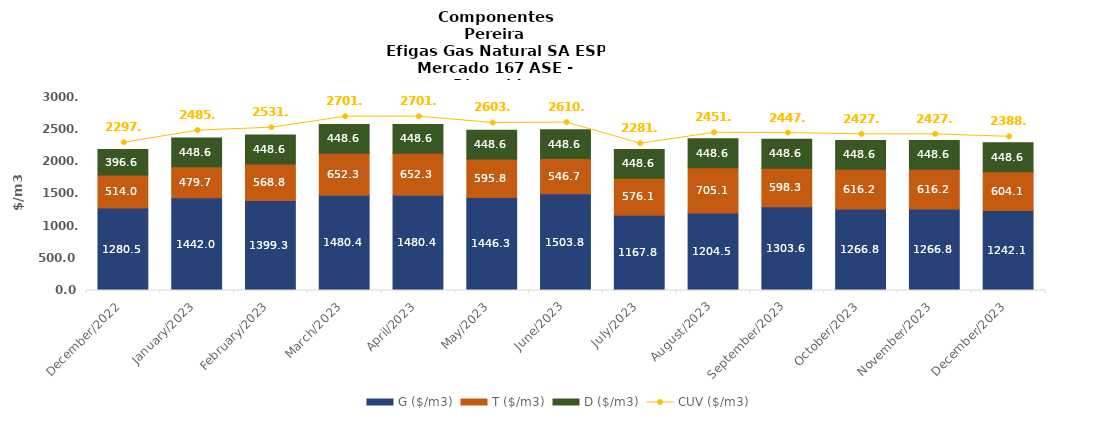
| Category | G ($/m3) | T ($/m3) | D ($/m3) |
|---|---|---|---|
| 2022-12-01 | 1280.49 | 513.98 | 396.6 |
| 2023-01-01 | 1442 | 479.72 | 448.63 |
| 2023-02-01 | 1399.342 | 568.805 | 448.635 |
| 2023-03-01 | 1480.39 | 652.25 | 448.635 |
| 2023-04-01 | 1480.39 | 652.25 | 448.635 |
| 2023-05-01 | 1446.347 | 595.782 | 448.635 |
| 2023-06-01 | 1503.75 | 546.731 | 448.635 |
| 2023-07-01 | 1167.85 | 576.067 | 448.635 |
| 2023-08-01 | 1204.533 | 705.123 | 448.635 |
| 2023-09-01 | 1303.571 | 598.275 | 448.635 |
| 2023-10-01 | 1266.828 | 616.197 | 448.635 |
| 2023-11-01 | 1266.828 | 616.197 | 448.635 |
| 2023-12-01 | 1242.144 | 604.124 | 448.635 |